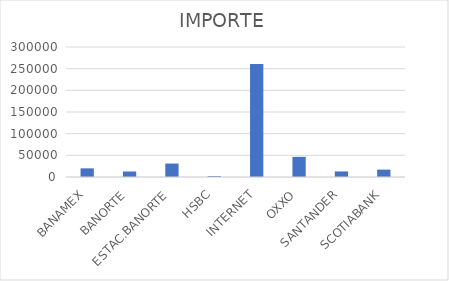
| Category | IMPORTE |
|---|---|
| BANAMEX | 19941.59 |
| BANORTE | 12701.19 |
| ESTAC.BANORTE | 31000 |
| HSBC | 2190.96 |
| INTERNET | 260805.85 |
| OXXO | 46457.46 |
| SANTANDER | 12857.07 |
| SCOTIABANK | 17031.12 |